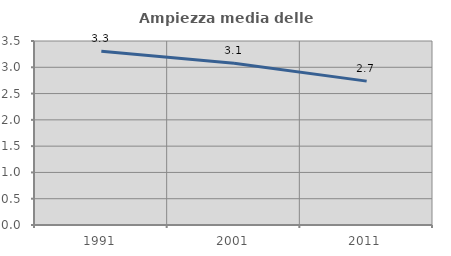
| Category | Ampiezza media delle famiglie |
|---|---|
| 1991.0 | 3.305 |
| 2001.0 | 3.075 |
| 2011.0 | 2.737 |